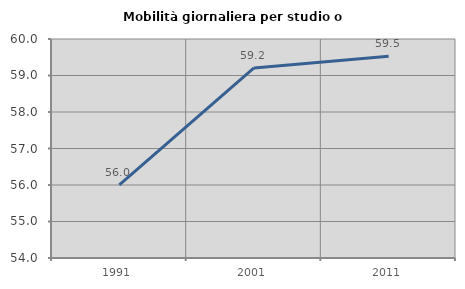
| Category | Mobilità giornaliera per studio o lavoro |
|---|---|
| 1991.0 | 56.005 |
| 2001.0 | 59.206 |
| 2011.0 | 59.526 |